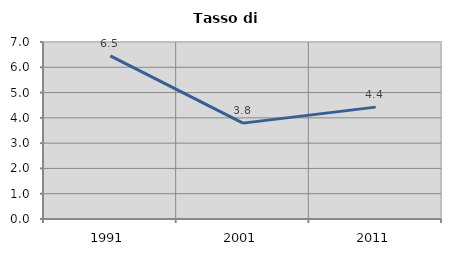
| Category | Tasso di disoccupazione   |
|---|---|
| 1991.0 | 6.452 |
| 2001.0 | 3.791 |
| 2011.0 | 4.425 |